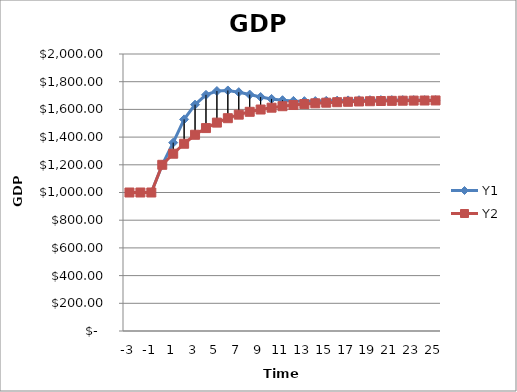
| Category | Y1 | Y2 |
|---|---|---|
| -3.0 | 1000 | 1000 |
| -2.0 | 1000 | 1000 |
| -1.0 | 1000 | 1000 |
| 0.0 | 1200 | 1200 |
| 1.0 | 1360 | 1280 |
| 2.0 | 1528 | 1352 |
| 3.0 | 1634.4 | 1416.8 |
| 4.0 | 1705.12 | 1465.12 |
| 5.0 | 1732.576 | 1504.608 |
| 6.0 | 1736.765 | 1536.547 |
| 7.0 | 1724.391 | 1562.052 |
| 8.0 | 1707.093 | 1582.591 |
| 9.0 | 1689.523 | 1599.102 |
| 10.0 | 1675.72 | 1612.364 |
| 11.0 | 1666.353 | 1623.025 |
| 12.0 | 1661.369 | 1631.593 |
| 13.0 | 1659.65 | 1638.479 |
| 14.0 | 1660.088 | 1644.013 |
| 15.0 | 1661.59 | 1648.46 |
| 16.0 | 1663.394 | 1652.034 |
| 17.0 | 1665.007 | 1654.907 |
| 18.0 | 1666.208 | 1657.216 |
| 19.0 | 1666.949 | 1659.071 |
| 20.0 | 1667.299 | 1660.562 |
| 21.0 | 1667.367 | 1661.761 |
| 22.0 | 1667.268 | 1662.724 |
| 23.0 | 1667.098 | 1663.498 |
| 24.0 | 1666.922 | 1664.12 |
| 25.0 | 1666.777 | 1664.62 |